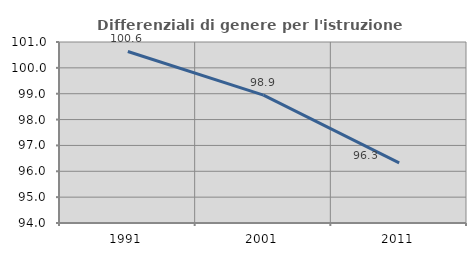
| Category | Differenziali di genere per l'istruzione superiore |
|---|---|
| 1991.0 | 100.634 |
| 2001.0 | 98.944 |
| 2011.0 | 96.329 |